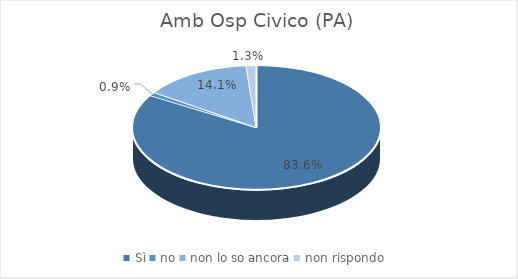
| Category | Amb Osp Civico (PA) |
|---|---|
| Sì | 0.836 |
| no | 0.009 |
| non lo so ancora | 0.141 |
| non rispondo | 0.013 |